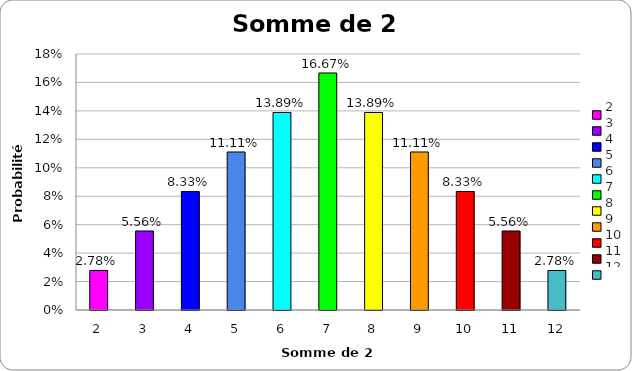
| Category | Probabilité 
théorique (%) |
|---|---|
| 2.0 | 0.028 |
| 3.0 | 0.056 |
| 4.0 | 0.083 |
| 5.0 | 0.111 |
| 6.0 | 0.139 |
| 7.0 | 0.167 |
| 8.0 | 0.139 |
| 9.0 | 0.111 |
| 10.0 | 0.083 |
| 11.0 | 0.056 |
| 12.0 | 0.028 |